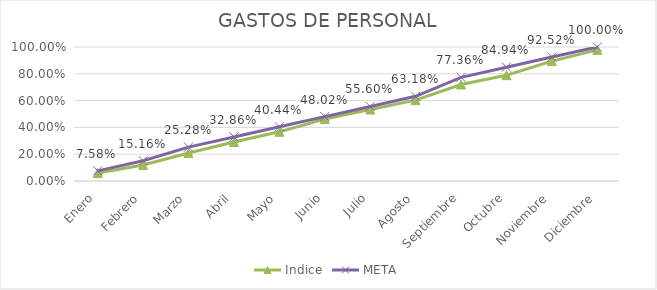
| Category | Indice | META |
|---|---|---|
| Enero | 0.06 | 0.076 |
| Febrero | 0.12 | 0.152 |
| Marzo | 0.208 | 0.253 |
| Abril | 0.291 | 0.329 |
| Mayo | 0.367 | 0.404 |
| Junio | 0.462 | 0.48 |
| Julio | 0.533 | 0.556 |
| Agosto | 0.603 | 0.632 |
| Septiembre | 0.72 | 0.774 |
| Octubre | 0.79 | 0.849 |
| Noviembre | 0.895 | 0.925 |
| Diciembre | 0.979 | 1 |